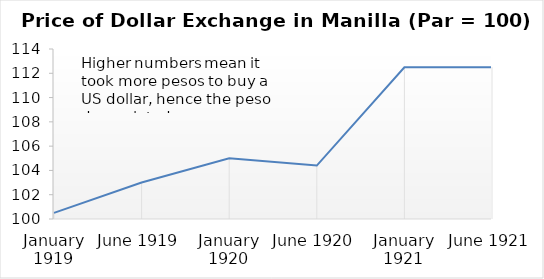
| Category | Price of Dollar Exchange in Manilla |
|---|---|
| January 1919 | 100.5 |
| June 1919 | 103 |
| January 1920 | 105 |
| June 1920 | 104.4 |
| January 1921 | 112.5 |
| June 1921 | 112.5 |